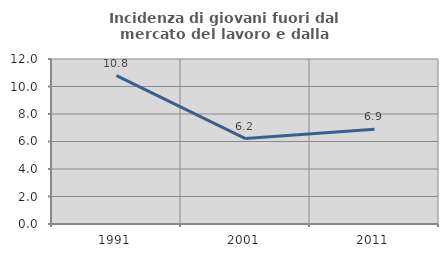
| Category | Incidenza di giovani fuori dal mercato del lavoro e dalla formazione  |
|---|---|
| 1991.0 | 10.794 |
| 2001.0 | 6.215 |
| 2011.0 | 6.887 |